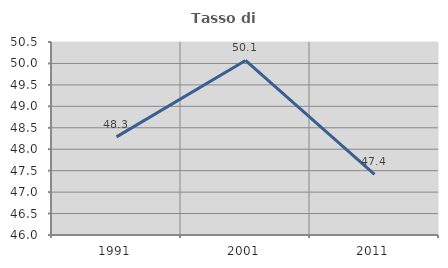
| Category | Tasso di occupazione   |
|---|---|
| 1991.0 | 48.288 |
| 2001.0 | 50.07 |
| 2011.0 | 47.411 |